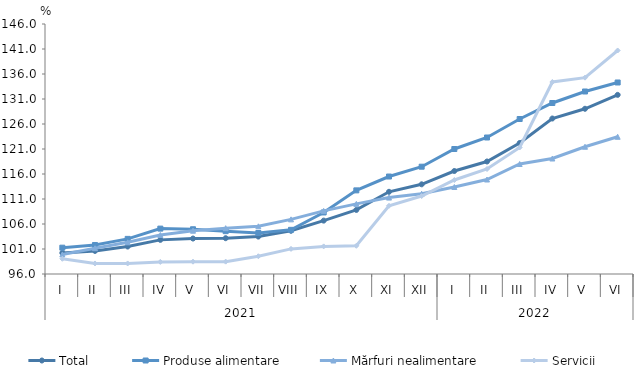
| Category | Total  | Produse alimentare | Mărfuri nealimentare  | Servicii |
|---|---|---|---|---|
| 0 | 100.216 | 101.263 | 99.917 | 99.046 |
| 1 | 100.619 | 101.8 | 101.154 | 98.109 |
| 2 | 101.493 | 103.024 | 102.337 | 98.107 |
| 3 | 102.826 | 105.075 | 103.801 | 98.417 |
| 4 | 103.092 | 104.95 | 104.66 | 98.463 |
| 5 | 103.16 | 104.567 | 105.161 | 98.472 |
| 6 | 103.487 | 104.197 | 105.536 | 99.549 |
| 7 | 104.645 | 104.834 | 106.928 | 101.023 |
| 8 | 106.675 | 108.308 | 108.624 | 101.521 |
| 9 | 108.814 | 112.725 | 110.021 | 101.642 |
| 10 | 112.438 | 115.494 | 111.282 | 109.649 |
| 11 | 113.937 | 117.461 | 112.055 | 111.591 |
| 12 | 116.6 | 121 | 113.4 | 114.8 |
| 13 | 118.5 | 123.3 | 114.9 | 117 |
| 14 | 122.2 | 127 | 118 | 121.3 |
| 15 | 127.1 | 130.2 | 119.1 | 134.4 |
| 16 | 129.047 | 132.5 | 121.45 | 135.267 |
| 17 | 131.827 | 134.301 | 123.443 | 140.701 |